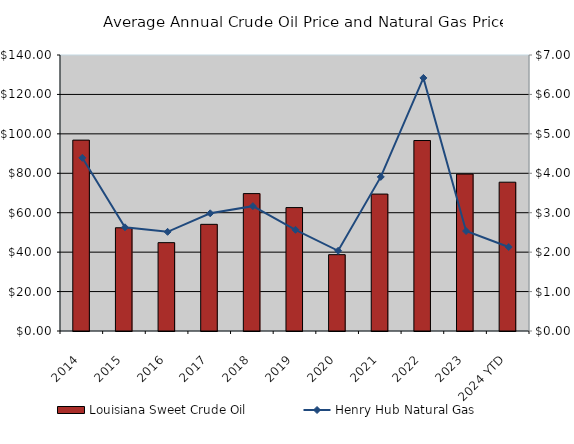
| Category | Louisiana Sweet Crude Oil |
|---|---|
| 2014 | 96.825 |
| 2015 | 52.363 |
| 2016 | 44.813 |
| 2017 | 54.102 |
| 2018 | 69.693 |
| 2019 | 62.599 |
| 2020 | 38.719 |
| 2021 | 69.461 |
| 2022 | 96.617 |
| 2023 | 79.603 |
| 2024 YTD | 75.48 |